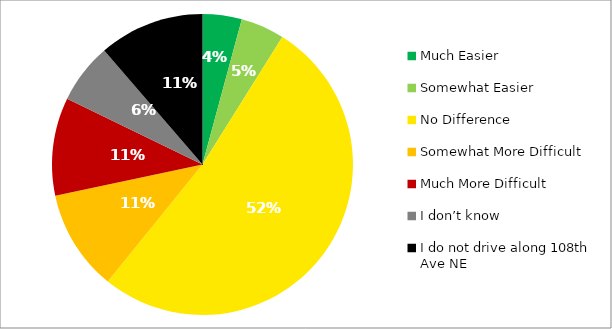
| Category | Responses |
|---|---|
| Much Easier | 0.042 |
| Somewhat Easier | 0.047 |
| No Difference | 0.519 |
| Somewhat More Difficult | 0.108 |
| Much More Difficult | 0.105 |
| I don’t know | 0.065 |
| I do not drive along 108th Ave NE | 0.113 |